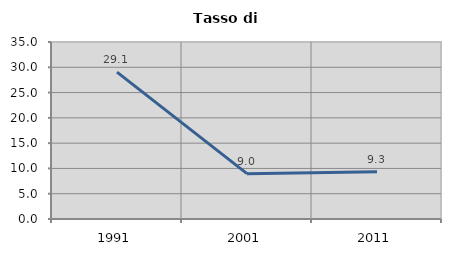
| Category | Tasso di disoccupazione   |
|---|---|
| 1991.0 | 29.051 |
| 2001.0 | 8.969 |
| 2011.0 | 9.348 |